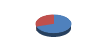
| Category | Series 0 |
|---|---|
| % USO | 0.7 |
| % DISP. | 0.3 |